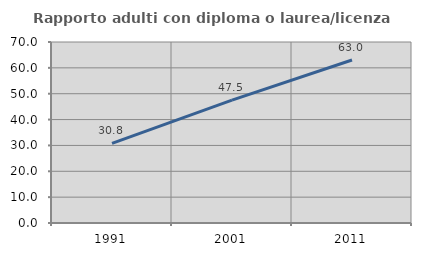
| Category | Rapporto adulti con diploma o laurea/licenza media  |
|---|---|
| 1991.0 | 30.769 |
| 2001.0 | 47.5 |
| 2011.0 | 63.043 |